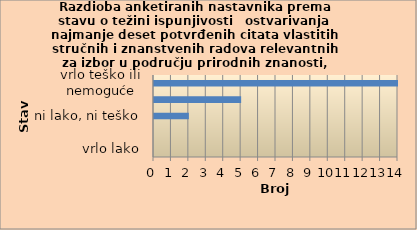
| Category | Series 0 |
|---|---|
| vrlo lako | 0 |
| lako | 0 |
| ni lako, ni teško | 2 |
| teško | 5 |
| vrlo teško ili nemoguće | 14 |